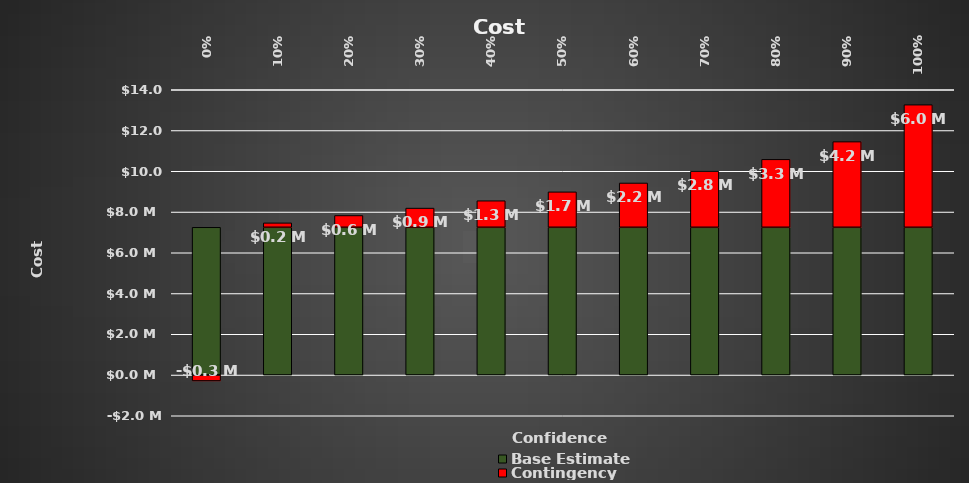
| Category | Base Estimate | Contingency |
|---|---|---|
| 0.0 | 7250000 | -290000 |
| 0.1 | 7250000 | 217500 |
| 0.2 | 7250000 | 580000 |
| 0.3 | 7250000 | 942500 |
| 0.4 | 7250000 | 1305000 |
| 0.5 | 7250000 | 1740000 |
| 0.6 | 7250000 | 2175000 |
| 0.7 | 7250000 | 2755000 |
| 0.8 | 7250000 | 3335000 |
| 0.9 | 7250000 | 4205000 |
| 1.0 | 7250000 | 6017500 |